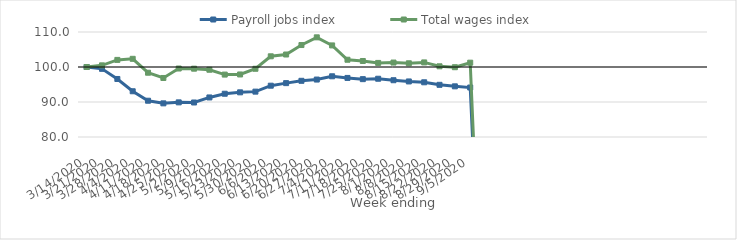
| Category | Payroll jobs index | Total wages index |
|---|---|---|
| 14/03/2020 | 100 | 100 |
| 21/03/2020 | 99.475 | 100.47 |
| 28/03/2020 | 96.58 | 102.031 |
| 04/04/2020 | 93.071 | 102.337 |
| 11/04/2020 | 90.364 | 98.365 |
| 18/04/2020 | 89.614 | 96.865 |
| 25/04/2020 | 89.896 | 99.566 |
| 02/05/2020 | 89.859 | 99.518 |
| 09/05/2020 | 91.301 | 99.217 |
| 16/05/2020 | 92.361 | 97.833 |
| 23/05/2020 | 92.762 | 97.869 |
| 30/05/2020 | 92.964 | 99.494 |
| 06/06/2020 | 94.66 | 103.055 |
| 13/06/2020 | 95.39 | 103.571 |
| 20/06/2020 | 96.058 | 106.276 |
| 27/06/2020 | 96.412 | 108.477 |
| 04/07/2020 | 97.347 | 106.17 |
| 11/07/2020 | 96.878 | 102.072 |
| 18/07/2020 | 96.53 | 101.718 |
| 25/07/2020 | 96.646 | 101.17 |
| 01/08/2020 | 96.222 | 101.27 |
| 08/08/2020 | 95.872 | 101.061 |
| 15/08/2020 | 95.63 | 101.31 |
| 22/08/2020 | 94.91 | 100.198 |
| 29/08/2020 | 94.478 | 99.942 |
| 05/09/2020 | 94.137 | 101.232 |